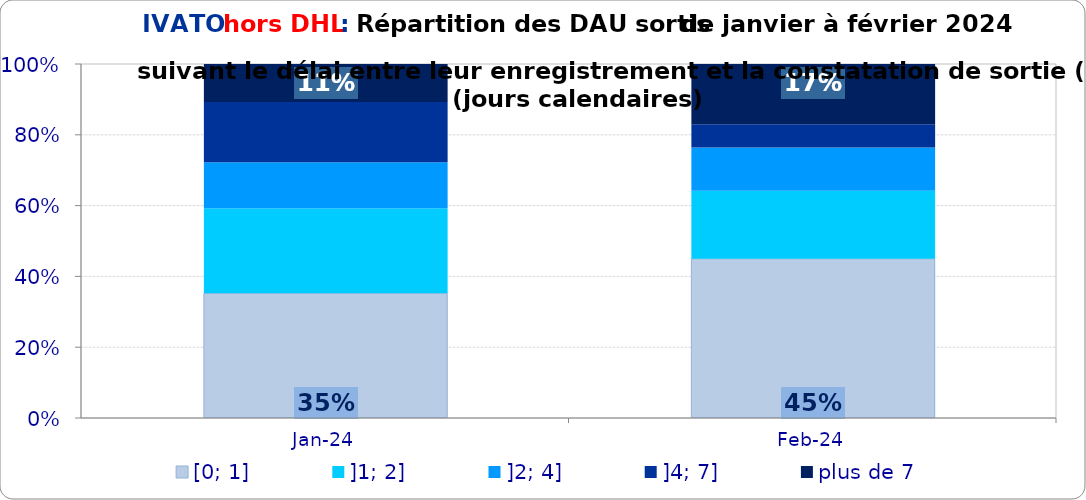
| Category | [0; 1] | ]1; 2] | ]2; 4] | ]4; 7] | plus de 7 |
|---|---|---|---|---|---|
| 2024-01-01 | 0.352 | 0.24 | 0.13 | 0.17 | 0.108 |
| 2024-02-01 | 0.45 | 0.192 | 0.122 | 0.066 | 0.17 |